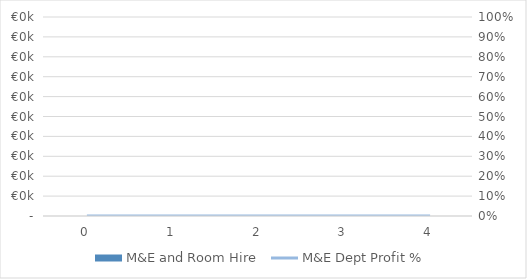
| Category | M&E and Room Hire |
|---|---|
| 0.0 | 0 |
| 1.0 | 0 |
| 2.0 | 0 |
| 3.0 | 0 |
| 4.0 | 0 |